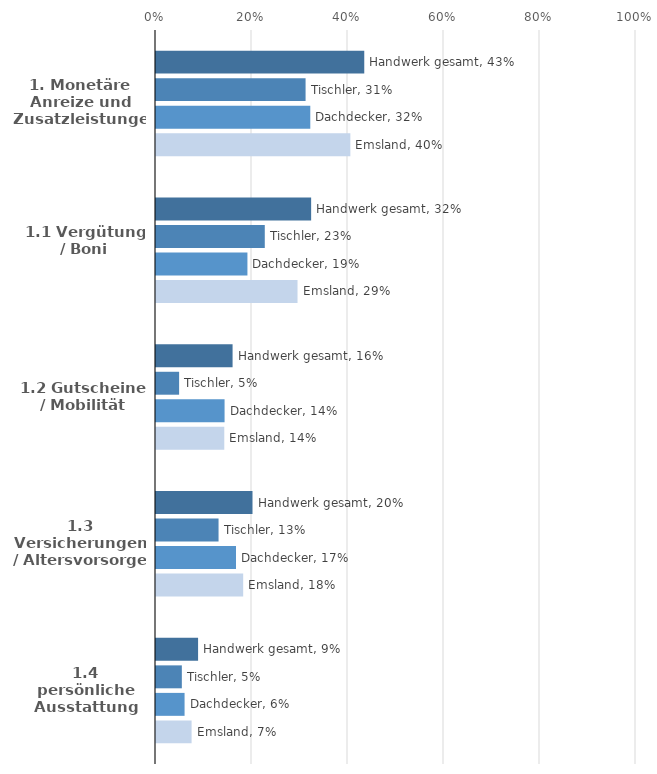
| Category | Handwerk gesamt | Tischler | Dachdecker | Emsland |
|---|---|---|---|---|
| 1. Monetäre Anreize und Zusatzleistungen | 0.434 | 0.312 | 0.321 | 0.405 |
| 1.1 Vergütung / Boni | 0.323 | 0.227 | 0.19 | 0.295 |
| 1.2 Gutscheine / Mobilität | 0.16 | 0.048 | 0.143 | 0.142 |
| 1.3 Versicherungen / Altersvorsorge | 0.201 | 0.13 | 0.167 | 0.182 |
| 1.4 persönliche Ausstattung | 0.088 | 0.054 | 0.06 | 0.074 |